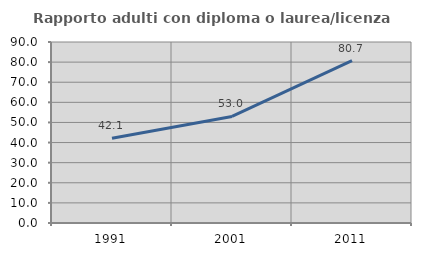
| Category | Rapporto adulti con diploma o laurea/licenza media  |
|---|---|
| 1991.0 | 42.102 |
| 2001.0 | 52.993 |
| 2011.0 | 80.685 |